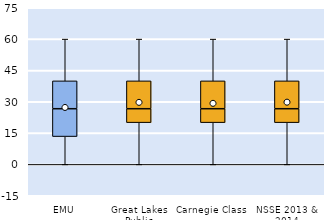
| Category | 25th | 50th | 75th |
|---|---|---|---|
| EMU | 13.333 | 13.333 | 13.333 |
| Great Lakes Public | 20 | 6.667 | 13.333 |
| Carnegie Class | 20 | 6.667 | 13.333 |
| NSSE 2013 & 2014 | 20 | 6.667 | 13.333 |